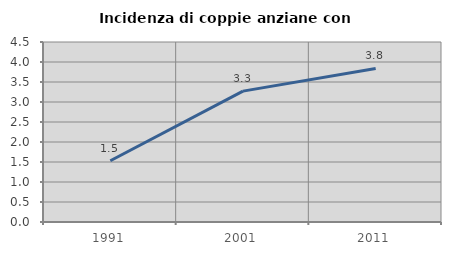
| Category | Incidenza di coppie anziane con figli |
|---|---|
| 1991.0 | 1.532 |
| 2001.0 | 3.272 |
| 2011.0 | 3.838 |